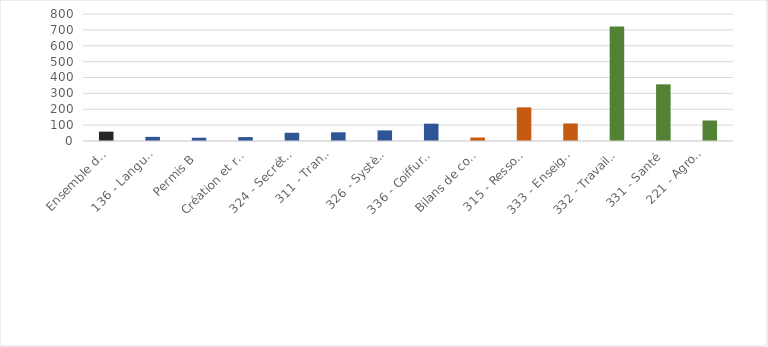
| Category | Durée moyenne des formations |
|---|---|
| Ensemble des formations | 59 |
| 136 - Langues vivantes | 26.015 |
| Permis B | 20.591 |
| Création et reprise d'entreprise | 24.685 |
| 324 - Secrétariat, bureautique | 51.918 |
| 311 - Transport (hors permis B),
manutention, magasinage | 54.892 |
| 326 - Systèmes d'information | 66.656 |
| 336 - Coiffure, esthétique | 109.103 |
| Bilans de compétences | 21.99 |
| 315 - Ressources humaines | 211.879 |
| 333 - Enseignement, formation | 110.48 |
| 332 - Travail social | 721.045 |
| 331 - Santé | 356.927 |
| 221 - Agroalimentaire,
alimentation, cuisine | 129.222 |